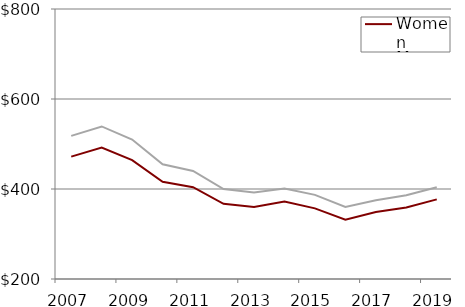
| Category | Women | Men |
|---|---|---|
| 2007.0 | 472 | 518 |
| 2008.0 | 492 | 539 |
| 2009.0 | 464 | 510 |
| 2010.0 | 416 | 455 |
| 2011.0 | 404 | 440 |
| 2012.0 | 367 | 400 |
| 2013.0 | 360 | 392 |
| 2014.0 | 372 | 401 |
| 2015.0 | 357 | 387 |
| 2016.0 | 332 | 360 |
| 2017.0 | 349 | 375 |
| 2018.0 | 359 | 386 |
| 2019.0 | 377 | 404 |